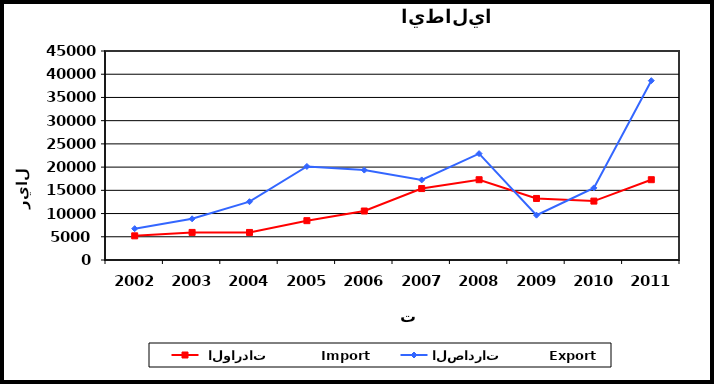
| Category |  الواردات           Import | الصادرات          Export |
|---|---|---|
| 2002.0 | 5203 | 6746 |
| 2003.0 | 5941 | 8865 |
| 2004.0 | 5932 | 12553 |
| 2005.0 | 8468 | 20145 |
| 2006.0 | 10550 | 19359 |
| 2007.0 | 15381 | 17239 |
| 2008.0 | 17288 | 22902 |
| 2009.0 | 13250 | 9653 |
| 2010.0 | 12682 | 15529 |
| 2011.0 | 17290 | 38611 |